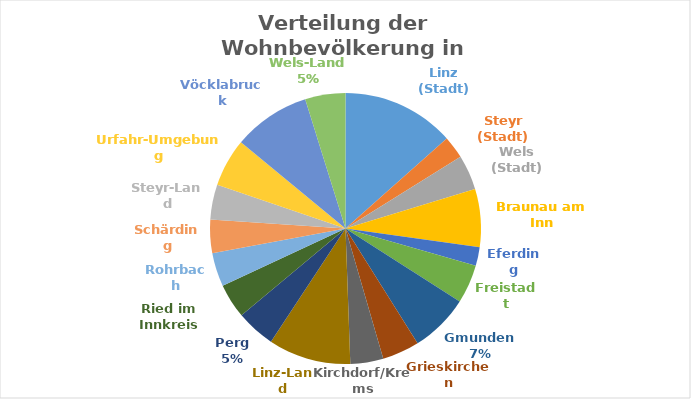
| Category | Series 0 |
|---|---|
| Linz (Stadt) | 189889 |
| Steyr (Stadt) | 38205 |
| Wels (Stadt) | 58591 |
| Braunau am Inn | 97826 |
| Eferding | 31741 |
| Freistadt | 65113 |
| Gmunden | 99403 |
| Grieskirchen | 62555 |
| Kirchdorf/Krems | 55557 |
| Linz-Land | 139116 |
| Perg | 65738 |
| Ried im Innkreis | 58553 |
| Rohrbach | 56688 |
| Schärding | 56426 |
| Steyr-Land | 58700 |
| Urfahr-Umgebung | 81400 |
| Vöcklabruck | 130316 |
| Wels-Land  | 67945 |